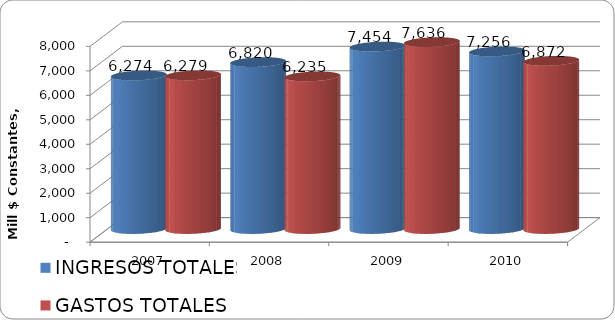
| Category | INGRESOS TOTALES | GASTOS TOTALES |
|---|---|---|
| 2007 | 6273.585 | 6278.857 |
| 2008 | 6819.94 | 6235.254 |
| 2009 | 7454.008 | 7635.58 |
| 2010 | 7256.495 | 6871.764 |